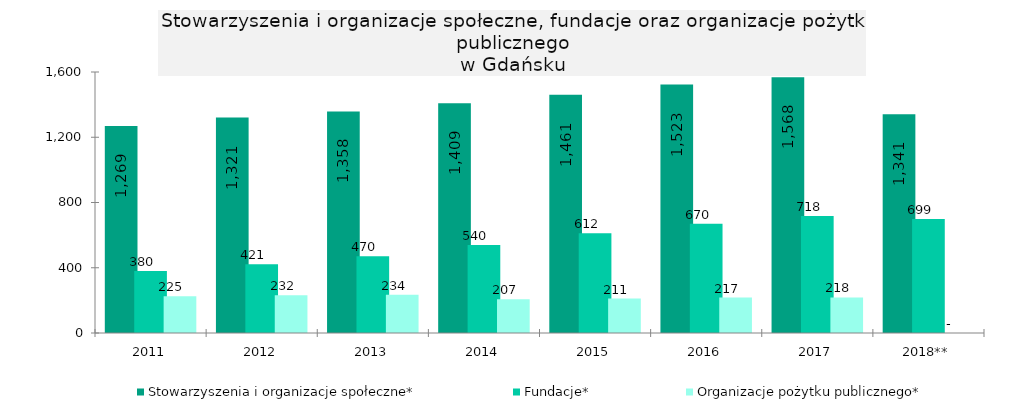
| Category | Stowarzyszenia i organizacje społeczne* | Fundacje* | Organizacje pożytku publicznego* |
|---|---|---|---|
| 2011 | 1269 | 380 | 225 |
| 2012 | 1321 | 421 | 232 |
| 2013 | 1358 | 470 | 234 |
| 2014 | 1409 | 540 | 207 |
| 2015 | 1461 | 612 | 211 |
| 2016 | 1523 | 670 | 217 |
| 2017 | 1568 | 718 | 218 |
| 2018** | 1341 | 699 | 0 |